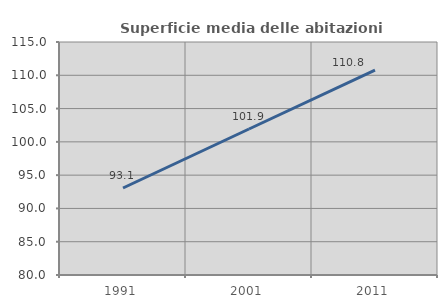
| Category | Superficie media delle abitazioni occupate |
|---|---|
| 1991.0 | 93.069 |
| 2001.0 | 101.929 |
| 2011.0 | 110.785 |